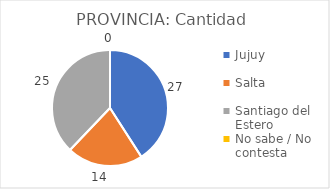
| Category | PROVINCIA: |
|---|---|
| Jujuy  | 0.409 |
| Salta  | 0.212 |
| Santiago del Estero  | 0.379 |
| No sabe / No contesta | 0 |